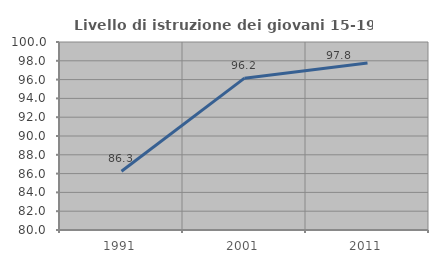
| Category | Livello di istruzione dei giovani 15-19 anni |
|---|---|
| 1991.0 | 86.25 |
| 2001.0 | 96.154 |
| 2011.0 | 97.778 |